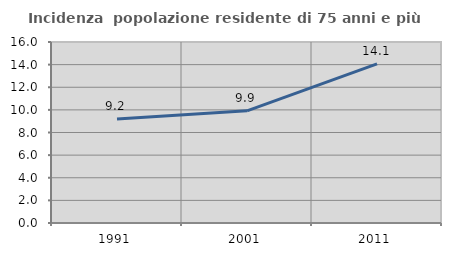
| Category | Incidenza  popolazione residente di 75 anni e più |
|---|---|
| 1991.0 | 9.197 |
| 2001.0 | 9.912 |
| 2011.0 | 14.064 |